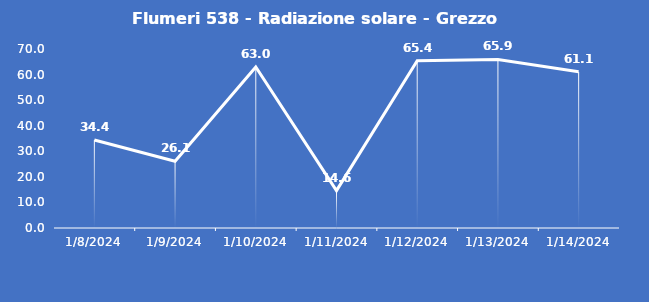
| Category | Flumeri 538 - Radiazione solare - Grezzo (W/m2) |
|---|---|
| 1/8/24 | 34.4 |
| 1/9/24 | 26.1 |
| 1/10/24 | 63 |
| 1/11/24 | 14.6 |
| 1/12/24 | 65.4 |
| 1/13/24 | 65.9 |
| 1/14/24 | 61.1 |